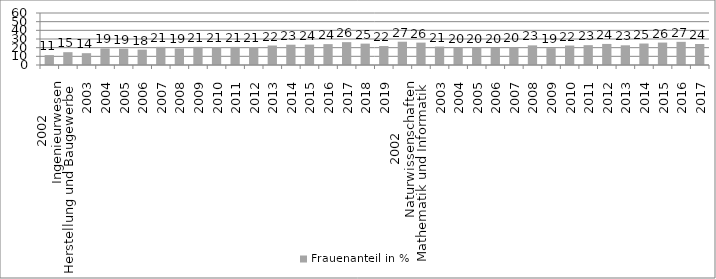
| Category | Frauenanteil in % |
|---|---|
| 0 | 11.41 |
| 1 | 14.801 |
| 2 | 13.64 |
| 3 | 19.101 |
| 4 | 18.863 |
| 5 | 17.723 |
| 6 | 20.925 |
| 7 | 19.125 |
| 8 | 20.943 |
| 9 | 20.681 |
| 10 | 20.878 |
| 11 | 20.651 |
| 12 | 22.468 |
| 13 | 23.415 |
| 14 | 23.533 |
| 15 | 24.085 |
| 16 | 26.38 |
| 17 | 24.658 |
| 18 | 21.875 |
| 19 | 26.86 |
| 20 | 25.85 |
| 21 | 21.281 |
| 22 | 19.895 |
| 23 | 19.94 |
| 24 | 19.646 |
| 25 | 20.314 |
| 26 | 22.655 |
| 27 | 19.468 |
| 28 | 22.428 |
| 29 | 22.884 |
| 30 | 24.304 |
| 31 | 22.734 |
| 32 | 24.775 |
| 33 | 25.89 |
| 34 | 26.714 |
| 35 | 24.233 |